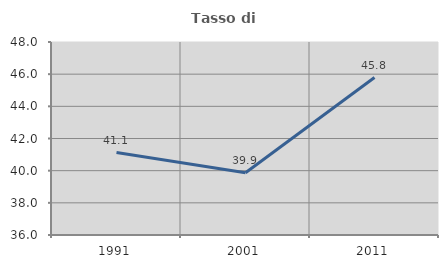
| Category | Tasso di occupazione   |
|---|---|
| 1991.0 | 41.126 |
| 2001.0 | 39.874 |
| 2011.0 | 45.788 |